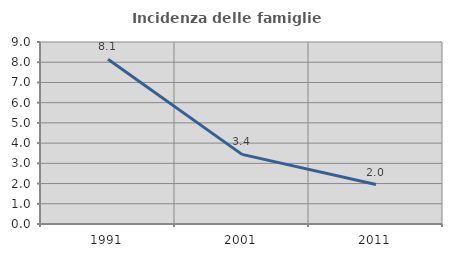
| Category | Incidenza delle famiglie numerose |
|---|---|
| 1991.0 | 8.145 |
| 2001.0 | 3.442 |
| 2011.0 | 1.95 |